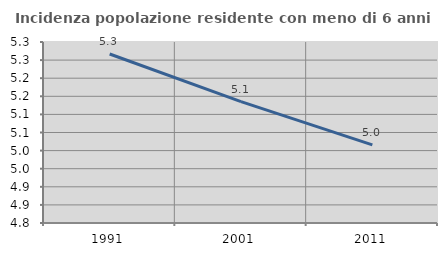
| Category | Incidenza popolazione residente con meno di 6 anni |
|---|---|
| 1991.0 | 5.267 |
| 2001.0 | 5.135 |
| 2011.0 | 5.016 |